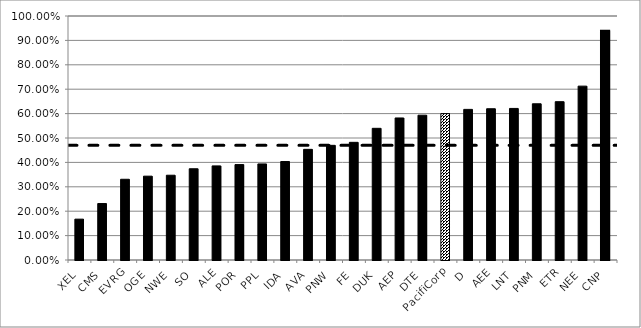
| Category | 2020-2024 |
|---|---|
| XEL | 0.167 |
| CMS | 0.231 |
| EVRG | 0.331 |
| OGE | 0.344 |
| NWE | 0.347 |
| SO | 0.374 |
| ALE | 0.386 |
| POR | 0.391 |
| PPL | 0.394 |
| IDA | 0.404 |
| AVA | 0.453 |
| PNW | 0.47 |
| FE | 0.482 |
| DUK | 0.54 |
| AEP | 0.582 |
| DTE | 0.593 |
| PacifiCorp | 0.6 |
| D | 0.617 |
| AEE | 0.62 |
| LNT | 0.621 |
| PNM | 0.64 |
| ETR | 0.649 |
| NEE | 0.713 |
| CNP | 0.939 |